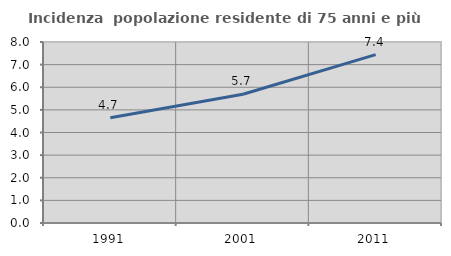
| Category | Incidenza  popolazione residente di 75 anni e più |
|---|---|
| 1991.0 | 4.651 |
| 2001.0 | 5.69 |
| 2011.0 | 7.444 |